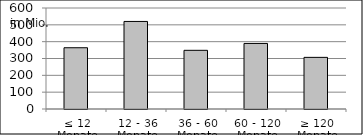
| Category | Volumen |
|---|---|
| ≤ 12 Monate | 363884341.26 |
| 12 - 36 Monate | 520155034.24 |
| 36 - 60 Monate | 348630525.27 |
| 60 - 120 Monate | 389469920.808 |
| ≥ 120 Monate | 306723576.426 |